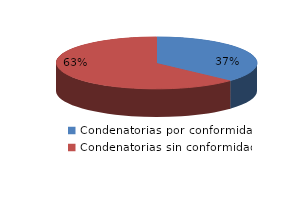
| Category | Series 0 |
|---|---|
| 0 | 217 |
| 1 | 371 |